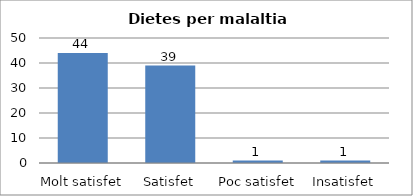
| Category | Series 0 |
|---|---|
| Molt satisfet | 44 |
| Satisfet | 39 |
| Poc satisfet | 1 |
| Insatisfet | 1 |